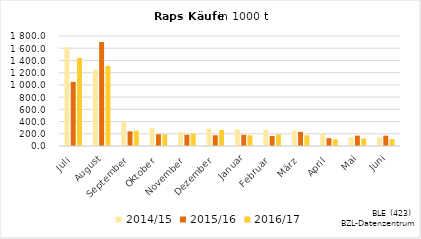
| Category | 2014/15 | 2015/16 | 2016/17 |
|---|---|---|---|
| Juli | 1618.026 | 1049.77 | 1441.579 |
| August | 1242.814 | 1702.261 | 1310.691 |
| September | 401.507 | 240.615 | 250.311 |
| Oktober | 294.217 | 192.527 | 188.831 |
| November | 229.2 | 183.996 | 203.044 |
| Dezember | 284.84 | 176.099 | 262.811 |
| Januar | 273.187 | 182.543 | 175.778 |
| Februar | 265.839 | 164.057 | 188.388 |
| März | 252.694 | 231.547 | 175.581 |
| April | 204.822 | 128.844 | 110.024 |
| Mai | 141.302 | 169.351 | 122.966 |
| Juni | 138.934 | 169.432 | 111.441 |